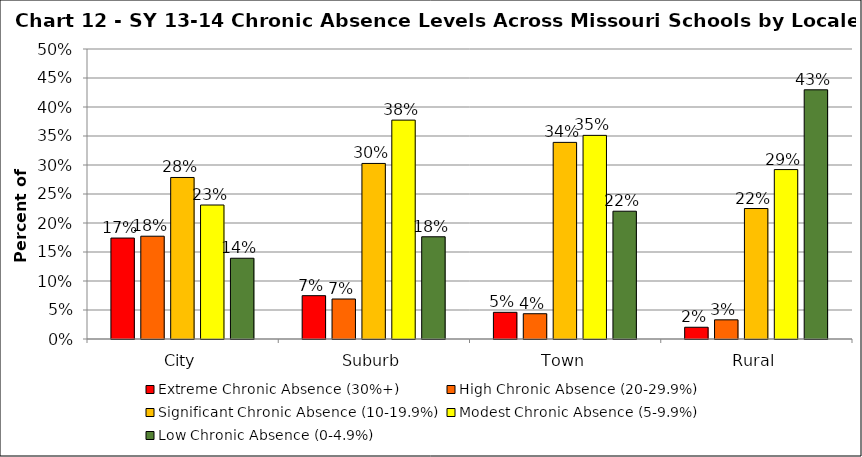
| Category | Extreme Chronic Absence (30%+) | High Chronic Absence (20-29.9%) | Significant Chronic Absence (10-19.9%) | Modest Chronic Absence (5-9.9%) | Low Chronic Absence (0-4.9%) |
|---|---|---|---|---|---|
| 0 | 0.174 | 0.177 | 0.278 | 0.231 | 0.139 |
| 1 | 0.075 | 0.069 | 0.303 | 0.377 | 0.176 |
| 2 | 0.046 | 0.044 | 0.339 | 0.351 | 0.22 |
| 3 | 0.02 | 0.033 | 0.225 | 0.292 | 0.43 |